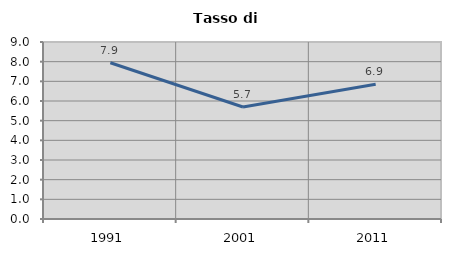
| Category | Tasso di disoccupazione   |
|---|---|
| 1991.0 | 7.943 |
| 2001.0 | 5.695 |
| 2011.0 | 6.853 |